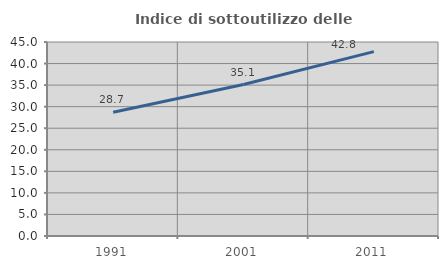
| Category | Indice di sottoutilizzo delle abitazioni  |
|---|---|
| 1991.0 | 28.714 |
| 2001.0 | 35.129 |
| 2011.0 | 42.768 |